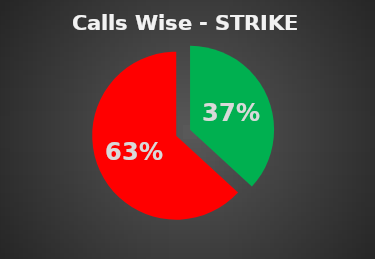
| Category | Series 0 |
|---|---|
| 0 | 0.368 |
| 1 | 0.632 |